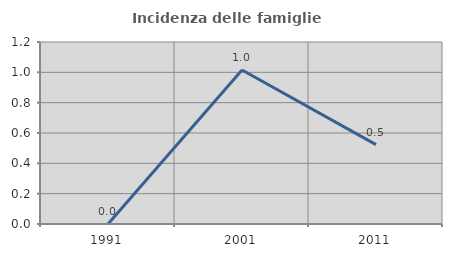
| Category | Incidenza delle famiglie numerose |
|---|---|
| 1991.0 | 0 |
| 2001.0 | 1.015 |
| 2011.0 | 0.524 |